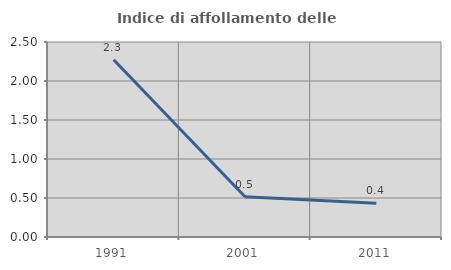
| Category | Indice di affollamento delle abitazioni  |
|---|---|
| 1991.0 | 2.273 |
| 2001.0 | 0.515 |
| 2011.0 | 0.433 |